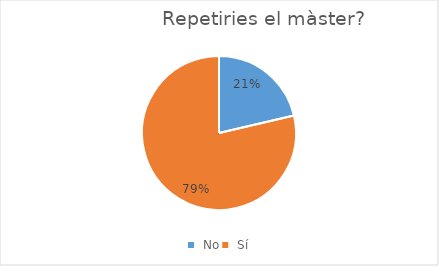
| Category | Series 0 |
|---|---|
|  No | 16 |
|  Sí | 59 |